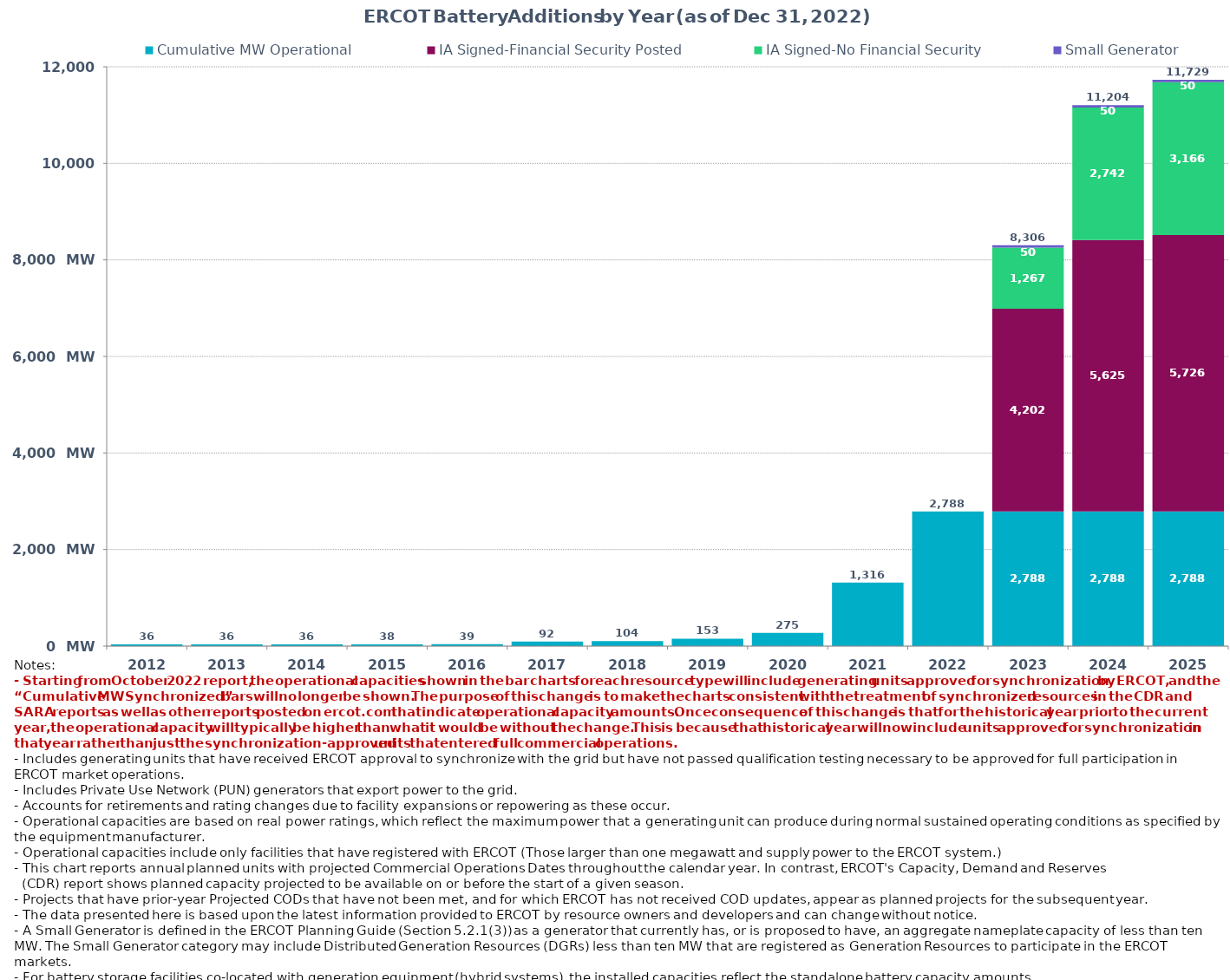
| Category | Cumulative MW Operational  | IA Signed-Financial Security Posted  | IA Signed-No Financial Security  | Small Generator | Cumulative Installed and Planned |
|---|---|---|---|---|---|
| 2012.0 | 36 | 0 | 0 | 0 | 36 |
| 2013.0 | 36 | 0 | 0 | 0 | 36 |
| 2014.0 | 36 | 0 | 0 | 0 | 36 |
| 2015.0 | 38 | 0 | 0 | 0 | 38 |
| 2016.0 | 39 | 0 | 0 | 0 | 39 |
| 2017.0 | 92.3 | 0 | 0 | 0 | 92.3 |
| 2018.0 | 103.7 | 0 | 0 | 0 | 103.7 |
| 2019.0 | 153.3 | 0 | 0 | 0 | 153.3 |
| 2020.0 | 275.4 | 0 | 0 | 0 | 275.4 |
| 2021.0 | 1316.43 | 0 | 0 | 0 | 1316.43 |
| 2022.0 | 2787.86 | 0 | 0 | 0 | 2787.86 |
| 2023.0 | 2787.86 | 4201.57 | 1266.76 | 49.75 | 8305.94 |
| 2024.0 | 2787.86 | 5624.92 | 2741.83 | 49.75 | 11204.36 |
| 2025.0 | 2787.86 | 5725.69 | 3166.19 | 49.75 | 11729.49 |